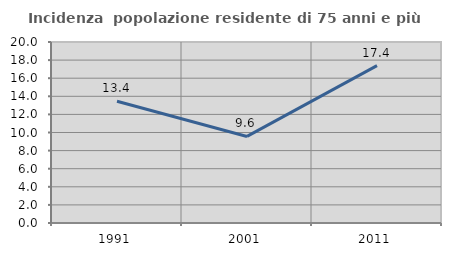
| Category | Incidenza  popolazione residente di 75 anni e più |
|---|---|
| 1991.0 | 13.445 |
| 2001.0 | 9.565 |
| 2011.0 | 17.391 |